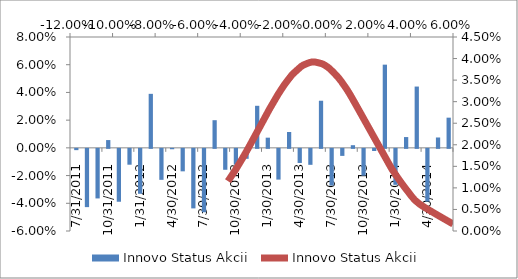
| Category | Innovo Status Akcii |
|---|---|
| 31/07/2011 | -0.001 |
| 31/08/2011 | -0.042 |
| 30/09/2011 | -0.036 |
| 31/10/2011 | 0.006 |
| 30/11/2011 | -0.038 |
| 31/12/2011 | -0.011 |
| 31/01/2012 | -0.032 |
| 29/02/2012 | 0.039 |
| 31/03/2012 | -0.022 |
| 30/04/2012 | 0 |
| 31/05/2012 | -0.016 |
| 30/06/2012 | -0.043 |
| 31/07/2012 | -0.046 |
| 31/08/2012 | 0.02 |
| 30/09/2012 | -0.015 |
| 31/10/2012 | -0.011 |
| 30/11/2012 | -0.007 |
| 31/12/2012 | 0.03 |
| 31/01/2013 | 0.007 |
| 28/02/2013 | -0.022 |
| 31/03/2013 | 0.011 |
| 30/04/2013 | -0.01 |
| 31/05/2013 | -0.012 |
| 30/06/2013 | 0.034 |
| 31/07/2013 | -0.026 |
| 31/08/2013 | -0.005 |
| 30/09/2013 | 0.002 |
| 31/10/2013 | -0.019 |
| 30/11/2013 | -0.002 |
| 31/12/2013 | 0.06 |
| 31/01/2014 | -0.026 |
| 28/02/2014 | 0.008 |
| 31/03/2014 | 0.044 |
| 30/04/2014 | -0.038 |
| 31/05/2014 | 0.007 |
| 30/06/2014 | 0.022 |